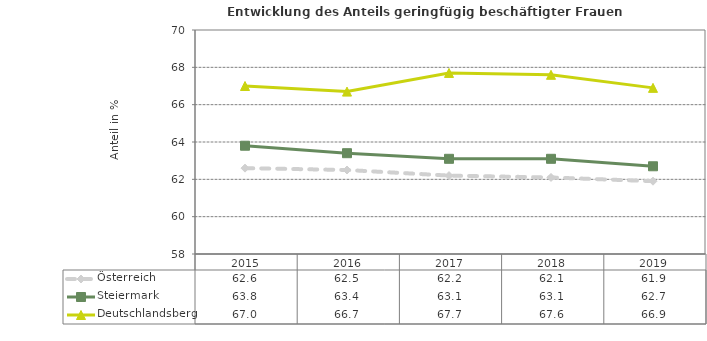
| Category | Österreich | Steiermark | Deutschlandsberg |
|---|---|---|---|
| 2019.0 | 61.9 | 62.7 | 66.9 |
| 2018.0 | 62.1 | 63.1 | 67.6 |
| 2017.0 | 62.2 | 63.1 | 67.7 |
| 2016.0 | 62.5 | 63.4 | 66.7 |
| 2015.0 | 62.6 | 63.8 | 67 |